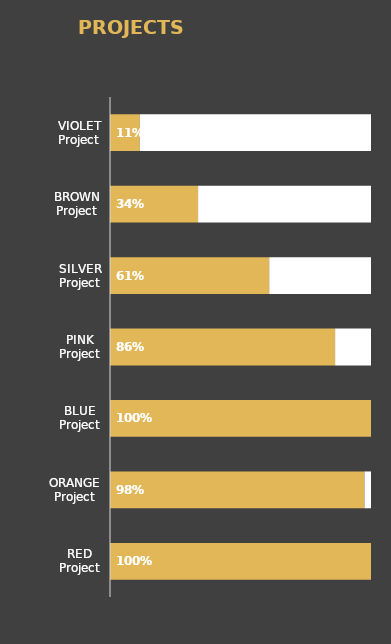
| Category | Series 0 | Series 1 |
|---|---|---|
| RED Project | 1 | 0 |
| ORANGE Project | 0.975 | 0.025 |
| BLUE Project | 1 | 0 |
| PINK Project | 0.862 | 0.138 |
| SILVER Project | 0.61 | 0.39 |
| BROWN Project | 0.338 | 0.662 |
| VIOLET Project | 0.114 | 0.886 |